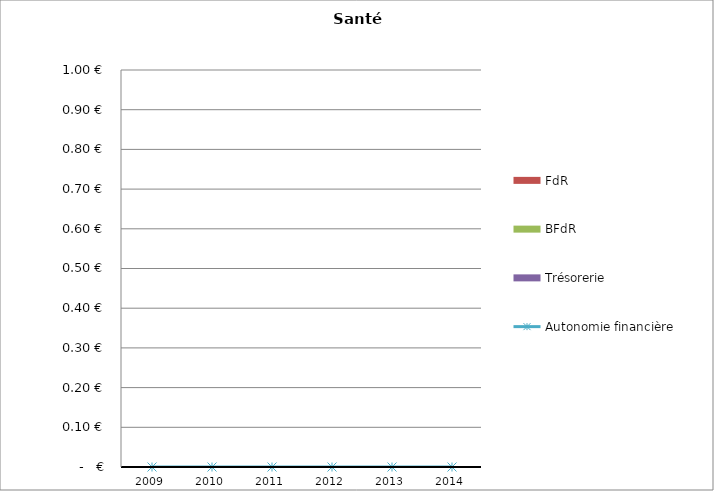
| Category | FdR | BFdR | Trésorerie |
|---|---|---|---|
| 2009.0 | 0 | 0 | 0 |
| 2010.0 | 0 | 0 | 0 |
| 2011.0 | 0 | 0 | 0 |
| 2012.0 | 0 | 0 | 0 |
| 2013.0 | 0 | 0 | 0 |
| 2014.0 | 0 | 0 | 0 |